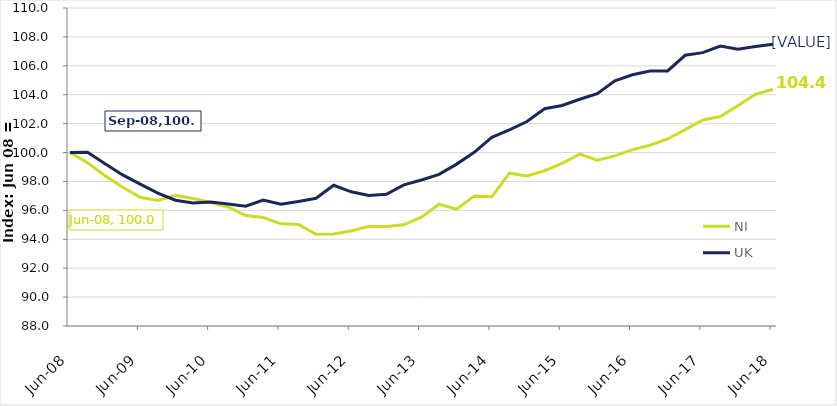
| Category | NI | UK |
|---|---|---|
| 2008-06-01 | 100 | 100 |
| 2008-09-01 | 99.291 | 100.021 |
| 2008-12-01 | 98.392 | 99.217 |
| 2009-03-01 | 97.599 | 98.452 |
| 2009-06-01 | 96.91 | 97.821 |
| 2009-09-01 | 96.68 | 97.2 |
| 2009-12-01 | 97.047 | 96.703 |
| 2010-03-01 | 96.82 | 96.509 |
| 2010-06-01 | 96.539 | 96.576 |
| 2010-09-01 | 96.232 | 96.442 |
| 2010-12-01 | 95.637 | 96.29 |
| 2011-03-01 | 95.503 | 96.71 |
| 2011-06-01 | 95.069 | 96.421 |
| 2011-09-01 | 95.027 | 96.618 |
| 2011-12-01 | 94.344 | 96.84 |
| 2012-03-01 | 94.358 | 97.736 |
| 2012-06-01 | 94.574 | 97.285 |
| 2012-09-01 | 94.894 | 97.027 |
| 2012-12-01 | 94.88 | 97.115 |
| 2013-03-01 | 95.001 | 97.768 |
| 2013-06-01 | 95.532 | 98.103 |
| 2013-09-01 | 96.424 | 98.487 |
| 2013-12-01 | 96.084 | 99.2 |
| 2014-03-01 | 96.984 | 100.014 |
| 2014-06-01 | 96.936 | 101.047 |
| 2014-09-01 | 98.57 | 101.576 |
| 2014-12-01 | 98.383 | 102.148 |
| 2015-03-01 | 98.74 | 103.029 |
| 2015-06-01 | 99.246 | 103.258 |
| 2015-09-01 | 99.891 | 103.685 |
| 2015-12-01 | 99.477 | 104.076 |
| 2016-03-01 | 99.77 | 104.965 |
| 2016-06-01 | 100.199 | 105.378 |
| 2016-09-01 | 100.508 | 105.635 |
| 2016-12-01 | 100.939 | 105.642 |
| 2017-03-01 | 101.582 | 106.728 |
| 2017-06-01 | 102.257 | 106.912 |
| 2017-09-01 | 102.488 | 107.367 |
| 2017-12-01 | 103.246 | 107.155 |
| 2018-03-01 | 104.031 | 107.331 |
| 2018-06-01 | 104.379 | 107.497 |